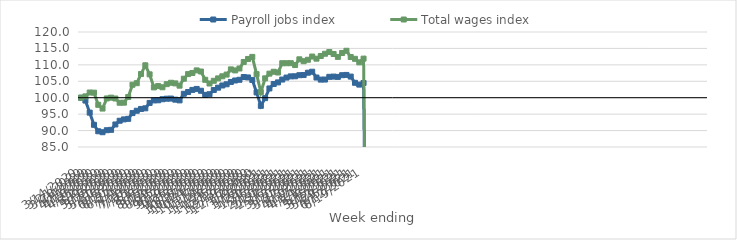
| Category | Payroll jobs index | Total wages index |
|---|---|---|
| 14/03/2020 | 100 | 100 |
| 21/03/2020 | 99.137 | 100.412 |
| 28/03/2020 | 95.461 | 101.586 |
| 04/04/2020 | 91.754 | 101.54 |
| 11/04/2020 | 89.789 | 97.84 |
| 18/04/2020 | 89.499 | 96.698 |
| 25/04/2020 | 90.108 | 99.776 |
| 02/05/2020 | 90.223 | 100.02 |
| 09/05/2020 | 91.859 | 99.757 |
| 16/05/2020 | 92.989 | 98.468 |
| 23/05/2020 | 93.402 | 98.489 |
| 30/05/2020 | 93.573 | 100.199 |
| 06/06/2020 | 95.323 | 103.947 |
| 13/06/2020 | 96.036 | 104.426 |
| 20/06/2020 | 96.58 | 107.222 |
| 27/06/2020 | 96.774 | 109.861 |
| 04/07/2020 | 98.412 | 107.114 |
| 11/07/2020 | 99.176 | 103.14 |
| 18/07/2020 | 99.215 | 103.548 |
| 25/07/2020 | 99.537 | 103.179 |
| 01/08/2020 | 99.703 | 104.126 |
| 08/08/2020 | 99.739 | 104.548 |
| 15/08/2020 | 99.407 | 104.358 |
| 22/08/2020 | 99.195 | 103.668 |
| 29/08/2020 | 101.196 | 105.783 |
| 05/09/2020 | 101.742 | 107.189 |
| 12/09/2020 | 102.375 | 107.53 |
| 19/09/2020 | 102.673 | 108.315 |
| 26/09/2020 | 102.123 | 107.976 |
| 03/10/2020 | 100.866 | 105.449 |
| 10/10/2020 | 101.06 | 104.321 |
| 17/10/2020 | 102.337 | 105.151 |
| 24/10/2020 | 103.054 | 105.885 |
| 31/10/2020 | 103.72 | 106.518 |
| 07/11/2020 | 104.087 | 107.044 |
| 14/11/2020 | 104.8 | 108.62 |
| 21/11/2020 | 105.246 | 108.307 |
| 28/11/2020 | 105.46 | 108.895 |
| 05/12/2020 | 106.292 | 110.879 |
| 12/12/2020 | 106.169 | 111.796 |
| 19/12/2020 | 105.412 | 112.424 |
| 26/12/2020 | 101.61 | 107.182 |
| 02/01/2021 | 97.525 | 101.678 |
| 09/01/2021 | 99.873 | 105.891 |
| 16/01/2021 | 102.819 | 107.33 |
| 23/01/2021 | 104.162 | 107.906 |
| 30/01/2021 | 104.66 | 107.67 |
| 06/02/2021 | 105.527 | 110.496 |
| 13/02/2021 | 106.134 | 110.495 |
| 20/02/2021 | 106.498 | 110.515 |
| 27/02/2021 | 106.52 | 109.94 |
| 06/03/2021 | 106.852 | 111.686 |
| 13/03/2021 | 106.897 | 111.103 |
| 20/03/2021 | 107.611 | 111.551 |
| 27/03/2021 | 107.911 | 112.532 |
| 03/04/2021 | 106.146 | 111.884 |
| 10/04/2021 | 105.512 | 112.691 |
| 17/04/2021 | 105.532 | 113.376 |
| 24/04/2021 | 106.356 | 113.905 |
| 01/05/2021 | 106.426 | 113.306 |
| 08/05/2021 | 106.336 | 112.423 |
| 15/05/2021 | 106.853 | 113.618 |
| 22/05/2021 | 106.935 | 114.281 |
| 29/05/2021 | 106.43 | 112.383 |
| 05/06/2021 | 104.536 | 111.838 |
| 12/06/2021 | 103.989 | 110.758 |
| 19/06/2021 | 104.483 | 111.895 |